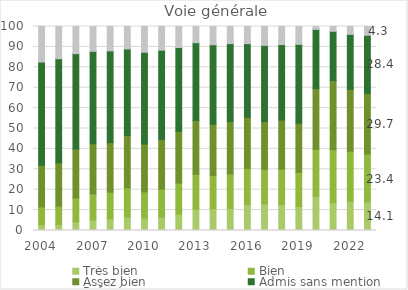
| Category | Très bien | Bien | Assez bien | Admis sans mention | Refusé |
|---|---|---|---|---|---|
| 2004 | 2.7 | 8.885 | 20.329 | 50.678 | 17.409 |
| 2005 | 2.893 | 9.04 | 21.268 | 50.992 | 15.807 |
| 2006 | 4.257 | 11.711 | 24.008 | 46.703 | 13.32 |
| 2007 | 5.232 | 12.708 | 24.578 | 45.303 | 12.178 |
| 2008 | 5.699 | 13.122 | 24.275 | 44.937 | 11.967 |
| 2009 | 6.64 | 14.323 | 25.601 | 42.442 | 10.993 |
| 2010 | 6.078 | 12.866 | 23.445 | 44.982 | 12.63 |
| 2011 | 6.638 | 13.657 | 24.424 | 43.666 | 11.614 |
| 2012 | 7.984 | 15.239 | 25.424 | 41.07 | 10.283 |
| 2013 | 10.534 | 17.047 | 26.404 | 38.076 | 7.939 |
| 2014 | 10.744 | 16.275 | 25.106 | 38.934 | 8.94 |
| 2015 | 10.833 | 16.977 | 25.662 | 38.126 | 8.402 |
| 2016 | 12.791 | 17.658 | 25.05 | 36.088 | 8.412 |
| 2017 | 13.024 | 16.889 | 23.495 | 37.339 | 9.253 |
| 2018 | 12.734 | 17.344 | 24.018 | 37.033 | 8.872 |
| 2019 | 11.727 | 16.814 | 24.096 | 38.616 | 8.747 |
| 2020 | 16.855 | 22.924 | 29.844 | 28.968 | 1.408 |
| 2021 | 13.63 | 25.956 | 33.99 | 24.07 | 2.353 |
| 2022 | 14.287 | 24.548 | 30.358 | 26.942 | 3.864 |
| 2023p | 14.097 | 23.422 | 29.733 | 28.441 | 4.307 |